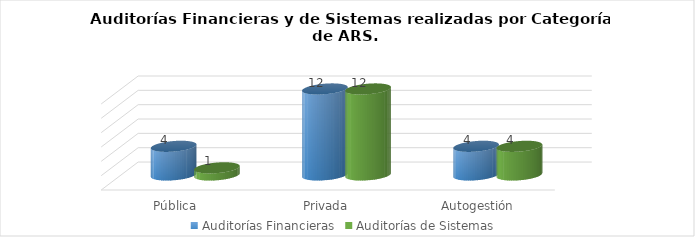
| Category | Auditorías Financieras | Auditorías de Sistemas |
|---|---|---|
| Pública | 4 | 1 |
| Privada | 12 | 12 |
| Autogestión | 4 | 4 |